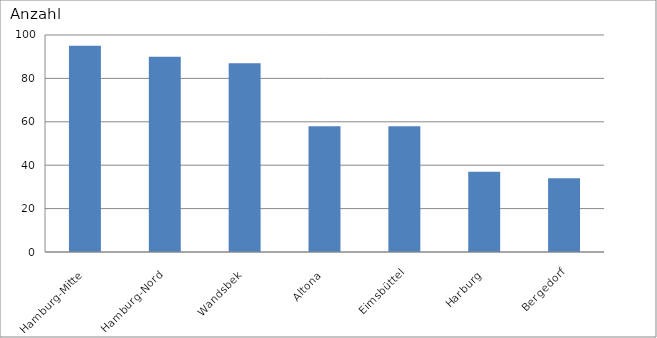
| Category | Hamburg-Mitte |
|---|---|
| Hamburg-Mitte | 95 |
| Hamburg-Nord | 90 |
| Wandsbek | 87 |
| Altona | 58 |
| Eimsbüttel | 58 |
| Harburg | 37 |
| Bergedorf | 34 |